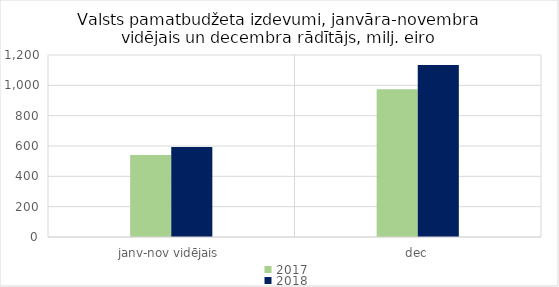
| Category | 2017 | 2018 |
|---|---|---|
| janv-nov vidējais | 540196.283 | 593880.982 |
| dec | 974003.677 | 1134353.728 |